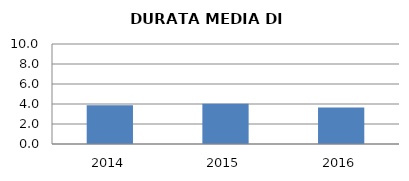
| Category | 2014 2015 2016 |
|---|---|
| 2014.0 | 3.871 |
| 2015.0 | 4.023 |
| 2016.0 | 3.644 |